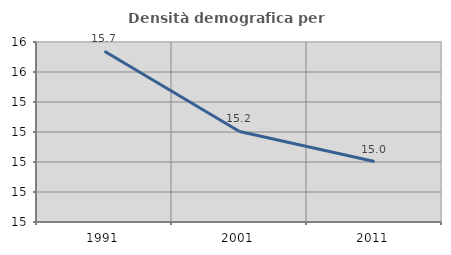
| Category | Densità demografica |
|---|---|
| 1991.0 | 15.739 |
| 2001.0 | 15.204 |
| 2011.0 | 15.003 |